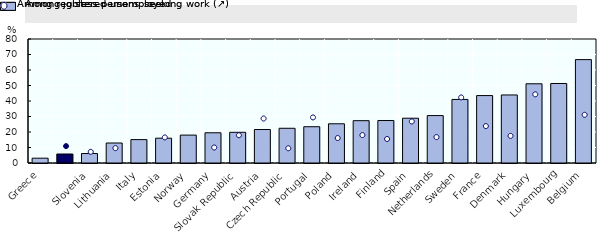
| Category | Among jobless persons seeking work (↗) |
|---|---|
| Greece | 3.1 |
|  | 5.8 |
| Slovenia | 6.1 |
| Lithuania | 12.9 |
| Italy | 15.1 |
| Estonia | 16 |
| Norway | 18 |
| Germany | 19.5 |
| Slovak Republic | 19.8 |
| Austria | 21.6 |
| Czech Republic | 22.4 |
| Portugal | 23.4 |
| Poland | 25.3 |
| Ireland | 27.3 |
| Finland | 27.4 |
| Spain | 28.9 |
| Netherlands | 30.6 |
| Sweden | 41 |
| France | 43.5 |
| Denmark | 43.9 |
| Hungary | 51.1 |
| Luxembourg | 51.3 |
| Belgium | 66.7 |